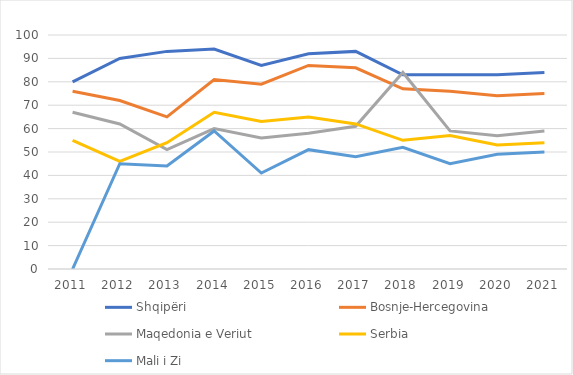
| Category | Shqipëri | Bosnje-Hercegovina | Maqedonia e Veriut | Serbia | Mali i Zi |
|---|---|---|---|---|---|
| 2011.0 | 80 | 76 | 67 | 55 | 0 |
| 2012.0 | 90 | 72 | 62 | 46 | 45 |
| 2013.0 | 93 | 65 | 51 | 54 | 44 |
| 2014.0 | 94 | 81 | 60 | 67 | 59 |
| 2015.0 | 87 | 79 | 56 | 63 | 41 |
| 2016.0 | 92 | 87 | 58 | 65 | 51 |
| 2017.0 | 93 | 86 | 61 | 62 | 48 |
| 2018.0 | 83 | 77 | 84 | 55 | 52 |
| 2019.0 | 83 | 76 | 59 | 57 | 45 |
| 2020.0 | 83 | 74 | 57 | 53 | 49 |
| 2021.0 | 84 | 75 | 59 | 54 | 50 |